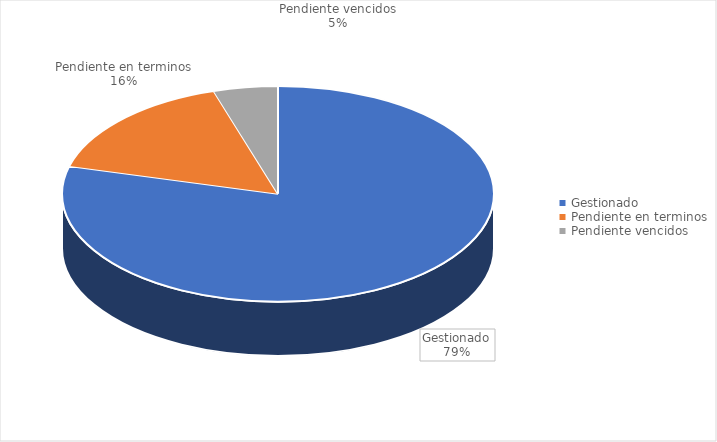
| Category | Total |
|---|---|
| Gestionado | 148 |
| Pendiente en terminos | 30 |
| Pendiente vencidos | 9 |